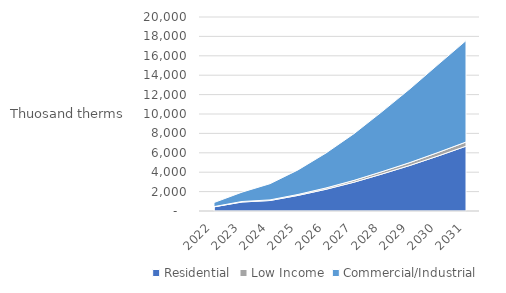
| Category | Residential | Low Income | Commercial/Industrial |
|---|---|---|---|
| 2022.0 | 429.213 | 23.182 | 419.461 |
| 2023.0 | 927.221 | 50.852 | 967.165 |
| 2024.0 | 1082.401 | 61.837 | 1671.884 |
| 2025.0 | 1608.335 | 95.813 | 2533.596 |
| 2026.0 | 2240.169 | 137.182 | 3600.492 |
| 2027.0 | 2971.951 | 185.612 | 4817.7 |
| 2028.0 | 3815.489 | 241.525 | 6189.163 |
| 2029.0 | 4699.72 | 300.121 | 7604.399 |
| 2030.0 | 5670.094 | 363.805 | 9064.754 |
| 2031.0 | 6681.489 | 429.323 | 10458.266 |